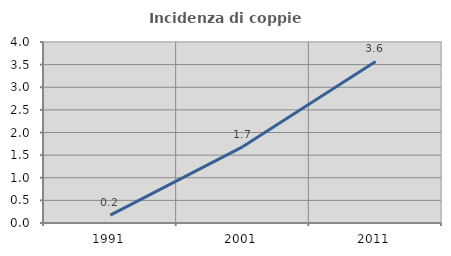
| Category | Incidenza di coppie miste |
|---|---|
| 1991.0 | 0.175 |
| 2001.0 | 1.689 |
| 2011.0 | 3.571 |